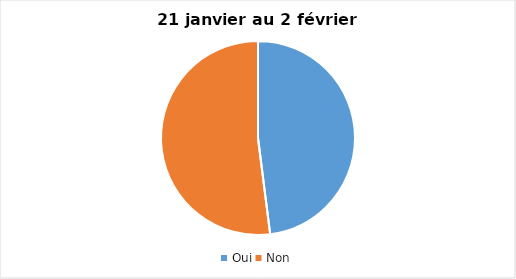
| Category | Series 0 |
|---|---|
| Oui | 48 |
| Non | 52 |